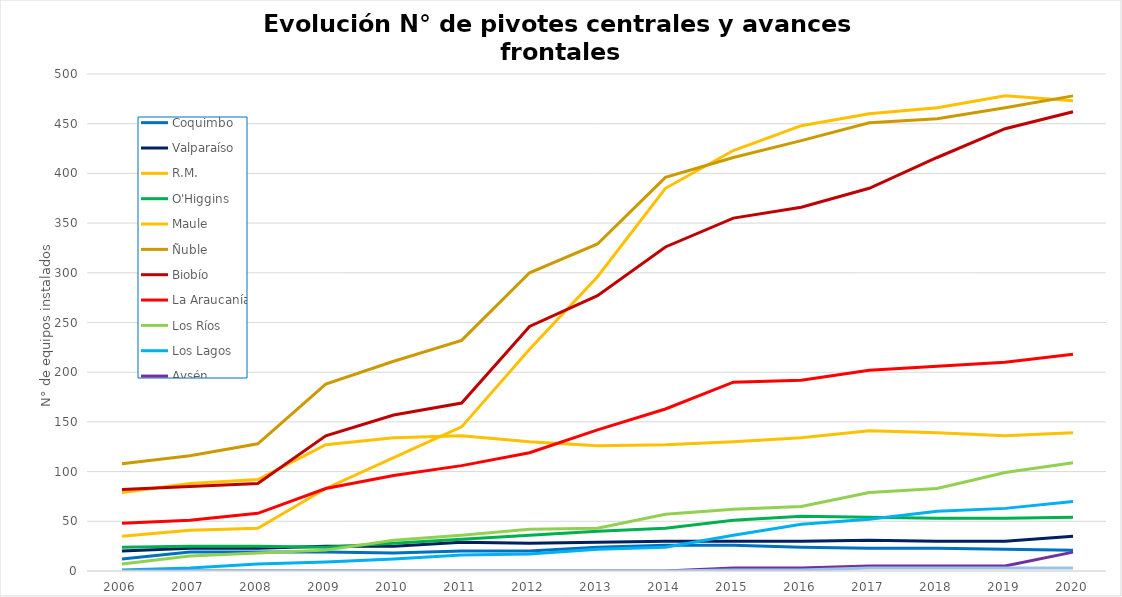
| Category | Coquimbo | Valparaíso | R.M. | O'Higgins | Maule | Ñuble | Biobío | La Araucanía | Los Ríos | Los Lagos | Aysén | Magallanes |
|---|---|---|---|---|---|---|---|---|---|---|---|---|
| 2006.0 | 12 | 20 | 79 | 24 | 35 | 108 | 82 | 48 | 7 | 1 | 0 | 0 |
| 2007.0 | 19 | 23 | 88 | 25 | 41 | 116 | 85 | 51 | 15 | 3 | 0 | 0 |
| 2008.0 | 19 | 23 | 92 | 25 | 43 | 128 | 88 | 58 | 18 | 7 | 0 | 0 |
| 2009.0 | 19 | 25 | 127 | 24 | 83 | 188 | 136 | 83 | 21 | 9 | 0 | 0 |
| 2010.0 | 18 | 25 | 134 | 28 | 114 | 211 | 157 | 96 | 31 | 12 | 0 | 0 |
| 2011.0 | 20 | 29 | 136 | 32 | 145 | 232 | 169 | 106 | 36 | 16 | 0 | 0 |
| 2012.0 | 20 | 28 | 130 | 36 | 223 | 300 | 246 | 119 | 42 | 17 | 0 | 0 |
| 2013.0 | 24 | 29 | 126 | 40 | 296 | 329 | 277 | 142 | 43 | 22 | 0 | 0 |
| 2014.0 | 26 | 30 | 127 | 43 | 385 | 396 | 326 | 163 | 57 | 24 | 0 | 0 |
| 2015.0 | 26 | 30 | 130 | 51 | 423 | 416 | 355 | 190 | 62 | 36 | 3 | 1 |
| 2016.0 | 24 | 30 | 134 | 55 | 448 | 433 | 366 | 192 | 65 | 47 | 3 | 1 |
| 2017.0 | 23 | 31 | 141 | 54 | 460 | 451 | 385 | 202 | 79 | 52 | 5 | 3 |
| 2018.0 | 23 | 30 | 139 | 53 | 466 | 455 | 416 | 206 | 83 | 60 | 5 | 3 |
| 2019.0 | 22 | 30 | 136 | 53 | 478 | 466 | 445 | 210 | 99 | 63 | 5 | 3 |
| 2020.0 | 21 | 35 | 139 | 54 | 473 | 478 | 462 | 218 | 109 | 70 | 19 | 3 |